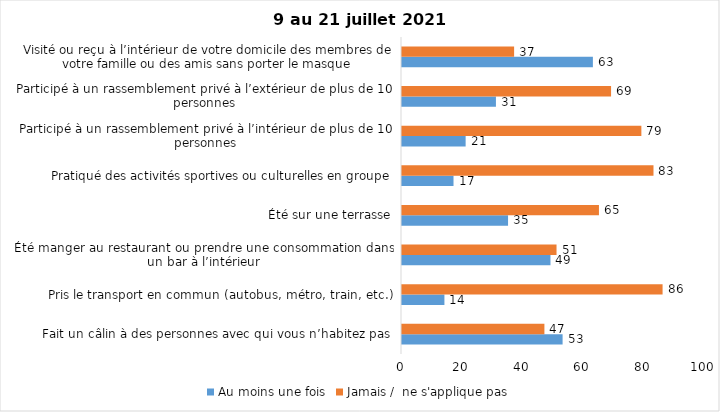
| Category | Au moins une fois | Jamais /  ne s'applique pas |
|---|---|---|
| Fait un câlin à des personnes avec qui vous n’habitez pas | 53 | 47 |
| Pris le transport en commun (autobus, métro, train, etc.) | 14 | 86 |
| Été manger au restaurant ou prendre une consommation dans un bar à l’intérieur | 49 | 51 |
| Été sur une terrasse | 35 | 65 |
| Pratiqué des activités sportives ou culturelles en groupe | 17 | 83 |
| Participé à un rassemblement privé à l’intérieur de plus de 10 personnes | 21 | 79 |
| Participé à un rassemblement privé à l’extérieur de plus de 10 personnes | 31 | 69 |
| Visité ou reçu à l’intérieur de votre domicile des membres de votre famille ou des amis sans porter le masque | 63 | 37 |